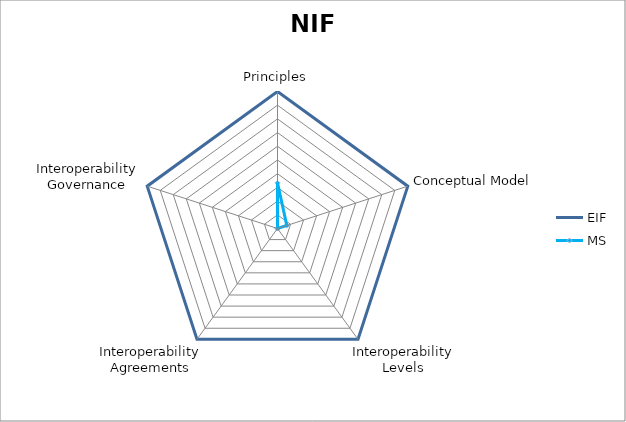
| Category | EIF | MS |
|---|---|---|
| Principles | 1 | 0.333 |
| Conceptual Model | 1 | 0.071 |
| Interoperability Levels | 1 | 0 |
| Interoperability Agreements | 1 | 0 |
| Interoperability Governance | 1 | 0 |